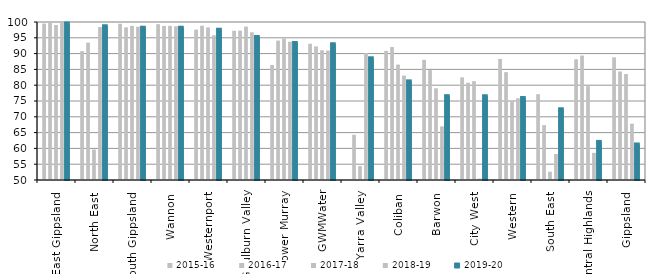
| Category | 2015-16 | 2016-17 | 2017-18 | 2018-19 | 2019-20 |
|---|---|---|---|---|---|
| East Gippsland  | 99.494 | 99.817 | 99.053 | 99.831 | 99.54 |
| North East  | 90.782 | 93.46 | 59.635 | 98.421 | 98.621 |
| South Gippsland  | 99.453 | 98.315 | 98.77 | 98.505 | 98.19 |
| Wannon  | 99.303 | 98.764 | 98.789 | 98.658 | 98.15 |
| Westernport  | 97.581 | 98.82 | 98.274 | 95.791 | 97.579 |
| Goulburn Valley  | 97.222 | 97.271 | 98.55 | 96.738 | 95.253 |
| Lower Murray  | 86.403 | 94.12 | 94.781 | 93.771 | 93.377 |
| GWMWater | 93.112 | 92.288 | 91.06 | 90.971 | 92.934 |
| Yarra Valley  | 46.857 | 64.309 | 54.418 | 90.179 | 88.523 |
| Coliban  | 90.871 | 92.087 | 86.525 | 83.033 | 81.213 |
| Barwon  | 88.042 | 84.766 | 79.031 | 66.971 | 76.526 |
| City West  | 82.466 | 80.759 | 81.273 | 50.457 | 76.5 |
| Western  | 88.325 | 84.13 | 74.982 | 75.847 | 75.938 |
| South East  | 77.152 | 67.364 | 52.635 | 58.229 | 72.379 |
| Central Highlands  | 88.205 | 89.392 | 79.701 | 58.589 | 62.05 |
| Gippsland  | 88.803 | 84.344 | 83.526 | 67.828 | 61.241 |